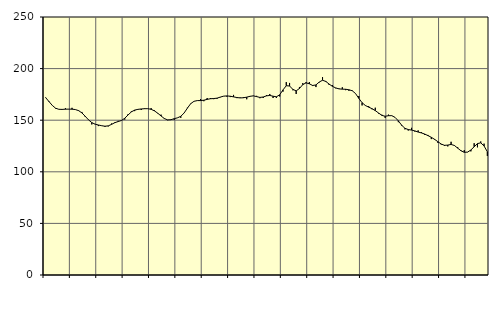
| Category | Piggar | Series 1 |
|---|---|---|
| nan | 171.5 | 171.88 |
| 87.0 | 168.6 | 168.1 |
| 87.0 | 164.5 | 164.39 |
| 87.0 | 161.3 | 161.65 |
| nan | 160.5 | 160.55 |
| 88.0 | 160.1 | 160.46 |
| 88.0 | 161.6 | 160.67 |
| 88.0 | 160.6 | 160.74 |
| nan | 162 | 160.68 |
| 89.0 | 160.4 | 160.33 |
| 89.0 | 159.6 | 159.26 |
| 89.0 | 158 | 157.08 |
| nan | 153.1 | 153.81 |
| 90.0 | 150.5 | 150.34 |
| 90.0 | 145.9 | 147.67 |
| 90.0 | 146 | 146.16 |
| nan | 144.3 | 145.35 |
| 91.0 | 144.8 | 144.66 |
| 91.0 | 143.5 | 144.16 |
| 91.0 | 144 | 144.53 |
| nan | 146.8 | 145.94 |
| 92.0 | 148.1 | 147.61 |
| 92.0 | 149.4 | 148.7 |
| 92.0 | 149.6 | 149.72 |
| nan | 150.6 | 151.87 |
| 93.0 | 155.8 | 155.08 |
| 93.0 | 158.6 | 158.05 |
| 93.0 | 158.8 | 159.78 |
| nan | 160.7 | 160.51 |
| 94.0 | 159.9 | 160.89 |
| 94.0 | 161.5 | 161.13 |
| 94.0 | 161.1 | 161.16 |
| nan | 161.7 | 160.56 |
| 95.0 | 159.6 | 159.05 |
| 95.0 | 156.5 | 156.81 |
| 95.0 | 155.4 | 154.09 |
| nan | 152 | 151.64 |
| 96.0 | 150 | 150.29 |
| 96.0 | 150.7 | 150.46 |
| 96.0 | 150.3 | 151.48 |
| nan | 152.4 | 152.31 |
| 97.0 | 152.3 | 153.77 |
| 97.0 | 156.9 | 156.96 |
| 97.0 | 162.1 | 161.67 |
| nan | 166.3 | 166.01 |
| 98.0 | 168.3 | 168.29 |
| 98.0 | 169.1 | 168.99 |
| 98.0 | 170.5 | 169.02 |
| nan | 168.4 | 169.37 |
| 99.0 | 171.5 | 170.17 |
| 99.0 | 171.5 | 170.81 |
| 99.0 | 170.4 | 170.99 |
| nan | 170.7 | 171.36 |
| 0.0 | 172.2 | 172.42 |
| 0.0 | 173.2 | 173.3 |
| 0.0 | 172.7 | 173.54 |
| nan | 172.4 | 173.23 |
| 1.0 | 174.5 | 172.61 |
| 1.0 | 171.4 | 171.97 |
| 1.0 | 172 | 171.58 |
| nan | 172.4 | 171.75 |
| 2.0 | 170.3 | 172.33 |
| 2.0 | 173.3 | 173.16 |
| 2.0 | 173.8 | 173.58 |
| nan | 173.6 | 172.87 |
| 3.0 | 171.3 | 172.08 |
| 3.0 | 171.5 | 172.49 |
| 3.0 | 174.4 | 173.6 |
| nan | 175.4 | 173.99 |
| 4.0 | 171.5 | 173.24 |
| 4.0 | 171.5 | 172.68 |
| 4.0 | 173 | 174.56 |
| nan | 177.7 | 179.34 |
| 5.0 | 186.9 | 183.4 |
| 5.0 | 186.1 | 183.15 |
| 5.0 | 179 | 179.86 |
| nan | 175.4 | 178.43 |
| 6.0 | 182.2 | 180.74 |
| 6.0 | 185.9 | 184.44 |
| 6.0 | 187 | 186.17 |
| nan | 187 | 185.26 |
| 7.0 | 183.1 | 183.64 |
| 7.0 | 182.1 | 184.18 |
| 7.0 | 186.6 | 186.99 |
| nan | 191.7 | 188.71 |
| 8.0 | 187 | 187.55 |
| 8.0 | 184.1 | 185 |
| 8.0 | 184 | 182.8 |
| nan | 180.9 | 181.28 |
| 9.0 | 180.7 | 180.33 |
| 9.0 | 181.9 | 180.07 |
| 9.0 | 179.1 | 179.98 |
| nan | 178.5 | 179.49 |
| 10.0 | 178.9 | 178.55 |
| 10.0 | 175.8 | 175.88 |
| 10.0 | 173.4 | 171.21 |
| nan | 164.3 | 166.94 |
| 11.0 | 164.5 | 164.23 |
| 11.0 | 163.6 | 162.66 |
| 11.0 | 160.6 | 161.18 |
| nan | 162.1 | 159.29 |
| 12.0 | 156.5 | 156.99 |
| 12.0 | 155.3 | 154.67 |
| 12.0 | 152.2 | 153.82 |
| nan | 155.4 | 154.35 |
| 13.0 | 154.2 | 154.39 |
| 13.0 | 152.8 | 152.73 |
| 13.0 | 148.1 | 149.35 |
| nan | 144.6 | 145.18 |
| 14.0 | 141.1 | 142.14 |
| 14.0 | 140 | 140.94 |
| 14.0 | 142.6 | 140.43 |
| nan | 139 | 139.64 |
| 15.0 | 140.1 | 138.52 |
| 15.0 | 138.4 | 137.67 |
| 15.0 | 135.7 | 136.57 |
| nan | 135.7 | 135.05 |
| 16.0 | 131.7 | 133.43 |
| 16.0 | 131 | 131.43 |
| 16.0 | 128 | 129.17 |
| nan | 126.4 | 126.9 |
| 17.0 | 125 | 125.65 |
| 17.0 | 124.6 | 125.88 |
| 17.0 | 129.1 | 126.5 |
| nan | 125.2 | 125.52 |
| 18.0 | 123.8 | 122.93 |
| 18.0 | 120.8 | 120.39 |
| 18.0 | 121 | 118.87 |
| nan | 119.2 | 119.08 |
| 19.0 | 119.8 | 121.15 |
| 19.0 | 127.7 | 124.25 |
| 19.0 | 123.7 | 127.32 |
| nan | 129.4 | 128.08 |
| 20.0 | 127.3 | 125.01 |
| 20.0 | 115.4 | 119.4 |